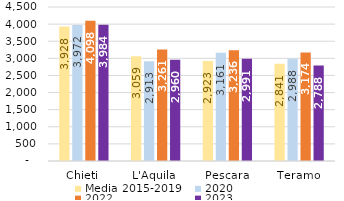
| Category | Media 2015-2019 | 2020 | 2022 | 2023 |
|---|---|---|---|---|
| Chieti | 3927.6 | 3972 | 4098 | 3984 |
| L'Aquila | 3058.8 | 2913 | 3261 | 2960 |
| Pescara | 2923.2 | 3161 | 3236 | 2991 |
| Teramo | 2841.4 | 2988 | 3174 | 2788 |